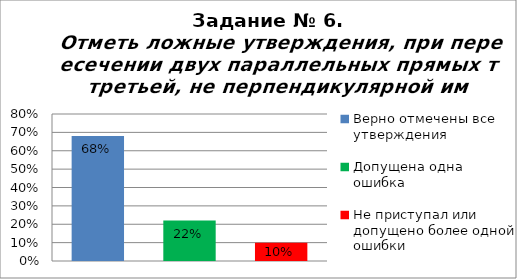
| Category | Отметь ложные утверждения, при пересечении двух параллельных прямых третьей, не перпендикулярной им. |
|---|---|
| Верно отмечены все утверждения | 0.68 |
| Допущена одна ошибка | 0.22 |
| Не приступал или допущено более одной ошибки | 0.1 |